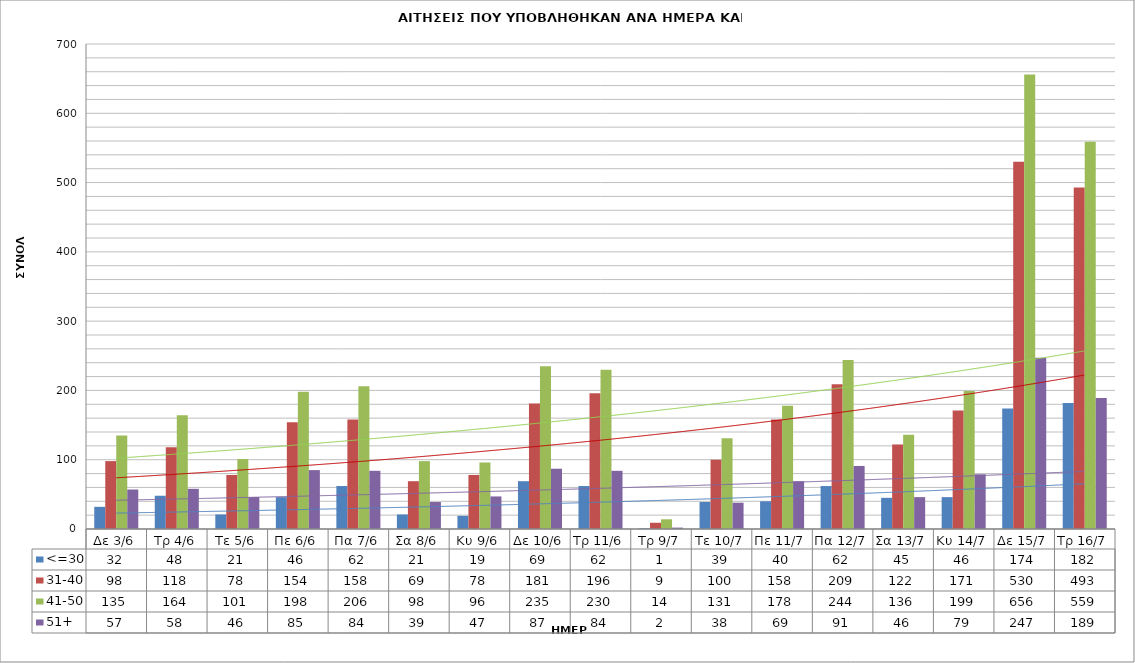
| Category | <=30 | 31-40 | 41-50 | 51+ |
|---|---|---|---|---|
| Δε 3/6 | 32 | 98 | 135 | 57 |
| Τρ 4/6 | 48 | 118 | 164 | 58 |
| Τε 5/6 | 21 | 78 | 101 | 46 |
| Πε 6/6 | 46 | 154 | 198 | 85 |
| Πα 7/6 | 62 | 158 | 206 | 84 |
| Σα 8/6 | 21 | 69 | 98 | 39 |
| Κυ 9/6 | 19 | 78 | 96 | 47 |
| Δε 10/6 | 69 | 181 | 235 | 87 |
| Τρ 11/6 | 62 | 196 | 230 | 84 |
| Τρ 9/7 | 1 | 9 | 14 | 2 |
| Τε 10/7 | 39 | 100 | 131 | 38 |
| Πε 11/7 | 40 | 158 | 178 | 69 |
| Πα 12/7 | 62 | 209 | 244 | 91 |
| Σα 13/7 | 45 | 122 | 136 | 46 |
| Κυ 14/7 | 46 | 171 | 199 | 79 |
| Δε 15/7 | 174 | 530 | 656 | 247 |
| Τρ 16/7 | 182 | 493 | 559 | 189 |